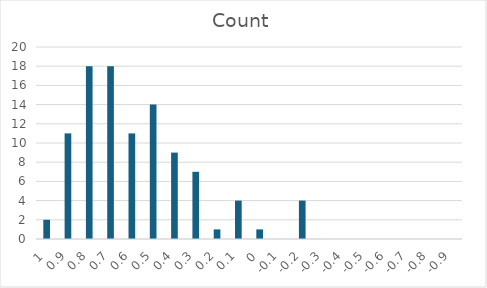
| Category | Series 0 |
|---|---|
| 1.0 | 2 |
| 0.9 | 11 |
| 0.8 | 18 |
| 0.7000000000000001 | 18 |
| 0.6000000000000001 | 11 |
| 0.5000000000000001 | 14 |
| 0.40000000000000013 | 9 |
| 0.30000000000000016 | 7 |
| 0.20000000000000015 | 1 |
| 0.10000000000000014 | 4 |
| 0.0 | 1 |
| -0.1 | 0 |
| -0.2 | 4 |
| -0.30000000000000004 | 0 |
| -0.4 | 0 |
| -0.5 | 0 |
| -0.6 | 0 |
| -0.7 | 0 |
| -0.7999999999999999 | 0 |
| -0.8999999999999999 | 0 |